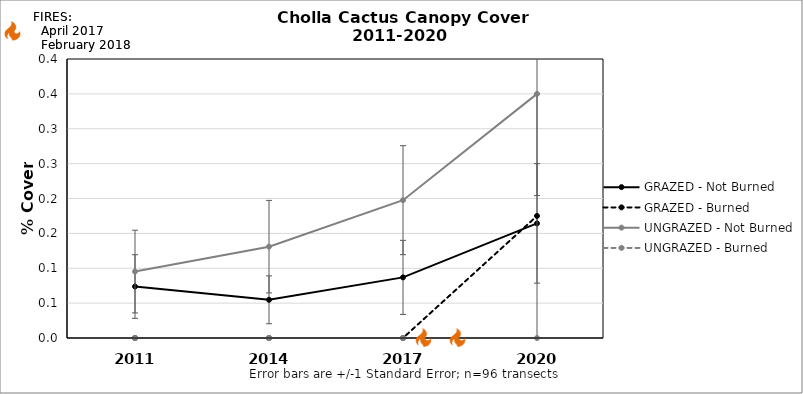
| Category | GRAZED - Not Burned | GRAZED - Burned | UNGRAZED - Not Burned | UNGRAZED - Burned |
|---|---|---|---|---|
| 2011.0 | 0.074 | 0 | 0.095 | 0 |
| 2014.0 | 0.055 | 0 | 0.131 | 0 |
| 2017.0 | 0.087 | 0 | 0.198 | 0 |
| 2020.0 | 0.164 | 0.175 | 0.35 | 0 |